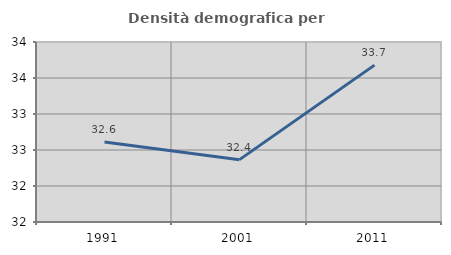
| Category | Densità demografica |
|---|---|
| 1991.0 | 32.611 |
| 2001.0 | 32.366 |
| 2011.0 | 33.679 |